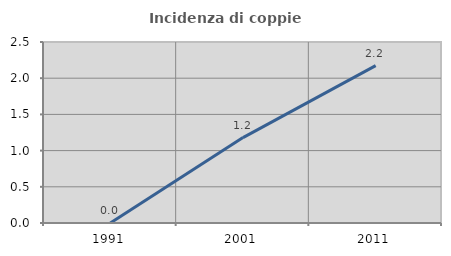
| Category | Incidenza di coppie miste |
|---|---|
| 1991.0 | 0 |
| 2001.0 | 1.18 |
| 2011.0 | 2.174 |